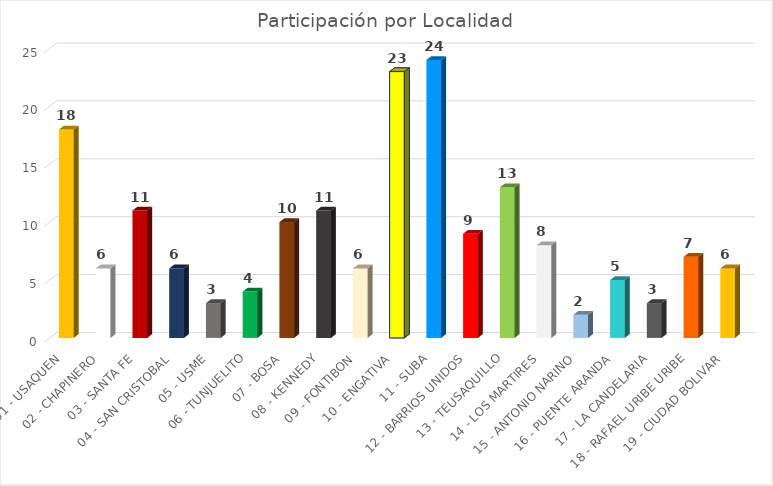
| Category | Peticiones |
|---|---|
| 01 - USAQUEN | 18 |
| 02 - CHAPINERO | 6 |
| 03 - SANTA FE | 11 |
| 04 - SAN CRISTOBAL | 6 |
| 05 - USME | 3 |
| 06 - TUNJUELITO | 4 |
| 07 - BOSA | 10 |
| 08 - KENNEDY | 11 |
| 09 - FONTIBON | 6 |
| 10 - ENGATIVA | 23 |
| 11 - SUBA | 24 |
| 12 - BARRIOS UNIDOS | 9 |
| 13 - TEUSAQUILLO | 13 |
| 14 - LOS MARTIRES | 8 |
| 15 - ANTONIO NARINO | 2 |
| 16 - PUENTE ARANDA | 5 |
| 17 - LA CANDELARIA | 3 |
| 18 - RAFAEL URIBE URIBE | 7 |
| 19 - CIUDAD BOLIVAR | 6 |